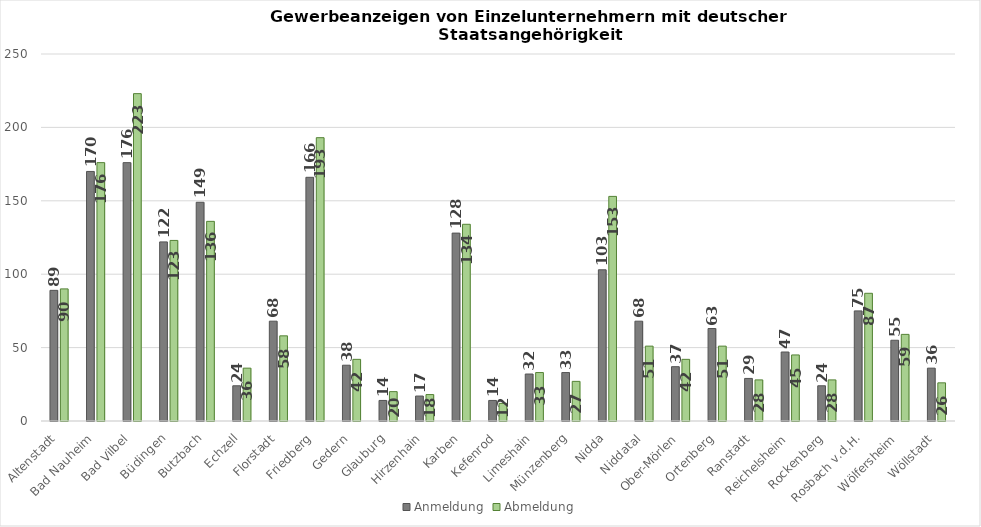
| Category | Anmeldung | Abmeldung |
|---|---|---|
| Altenstadt | 89 | 90 |
| Bad Nauheim | 170 | 176 |
| Bad Vilbel | 176 | 223 |
| Büdingen | 122 | 123 |
| Butzbach | 149 | 136 |
| Echzell | 24 | 36 |
| Florstadt | 68 | 58 |
| Friedberg | 166 | 193 |
| Gedern | 38 | 42 |
| Glauburg | 14 | 20 |
| Hirzenhain | 17 | 18 |
| Karben | 128 | 134 |
| Kefenrod | 14 | 12 |
| Limeshain | 32 | 33 |
| Münzenberg | 33 | 27 |
| Nidda | 103 | 153 |
| Niddatal | 68 | 51 |
| Ober-Mörlen | 37 | 42 |
| Ortenberg | 63 | 51 |
| Ranstadt | 29 | 28 |
| Reichelsheim | 47 | 45 |
| Rockenberg | 24 | 28 |
| Rosbach v.d.H. | 75 | 87 |
| Wölfersheim | 55 | 59 |
| Wöllstadt | 36 | 26 |